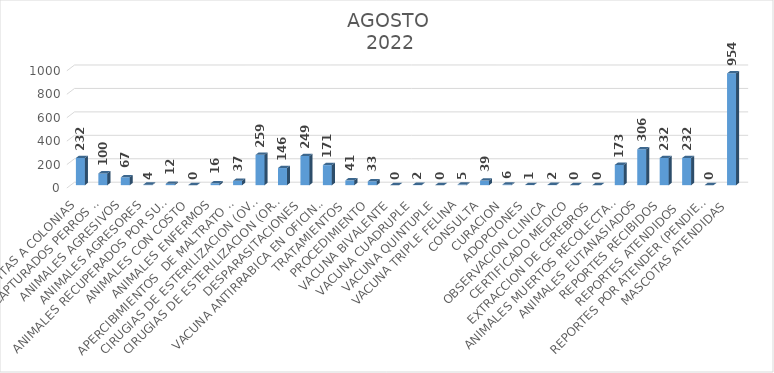
| Category | Series 0 |
|---|---|
| VISITAS A COLONIAS | 232 |
| ANIMALES CAPTURADOS PERROS Y GATOS  | 100 |
| ANIMALES AGRESIVOS | 67 |
| ANIMALES AGRESORES | 4 |
| ANIMALES RECUPERADOS POR SUS DUEÑOS | 12 |
| ANIMALES CON COSTO | 0 |
| ANIMALES ENFERMOS | 16 |
| APERCIBIMIENTOS  DE MALTRATO ANIMAL | 37 |
| CIRUGIAS DE ESTERILIZACION (OVH) hembra | 259 |
| CIRUGIAS DE ESTERILIZACION (ORQ) macho | 146 |
| DESPARASITACIONES | 249 |
| VACUNA ANTIRRABICA EN OFICINA Y CAMPAÑAS PASEOS DEL PRADO Y FOVISSSTE MIRAVALLE | 171 |
| TRATAMIENTOS | 41 |
| PROCEDIMIENTO | 33 |
| VACUNA BIVALENTE | 0 |
| VACUNA CUADRUPLE | 2 |
| VACUNA QUINTUPLE | 0 |
| VACUNA TRIPLE FELINA | 5 |
| CONSULTA | 39 |
| CURACION | 6 |
| ADOPCIONES | 1 |
| OBSERVACION CLINICA | 2 |
| CERTIFICADO MEDICO | 0 |
| EXTRACCION DE CEREBROS | 0 |
| ANIMALES MUERTOS RECOLECTADOS | 173 |
| ANIMALES EUTANASIADOS | 306 |
| REPORTES RECIBIDOS | 232 |
| REPORTES ATENDIDOS  | 232 |
| REPORTES POR ATENDER (PENDIENTES) | 0 |
| MASCOTAS ATENDIDAS | 954 |